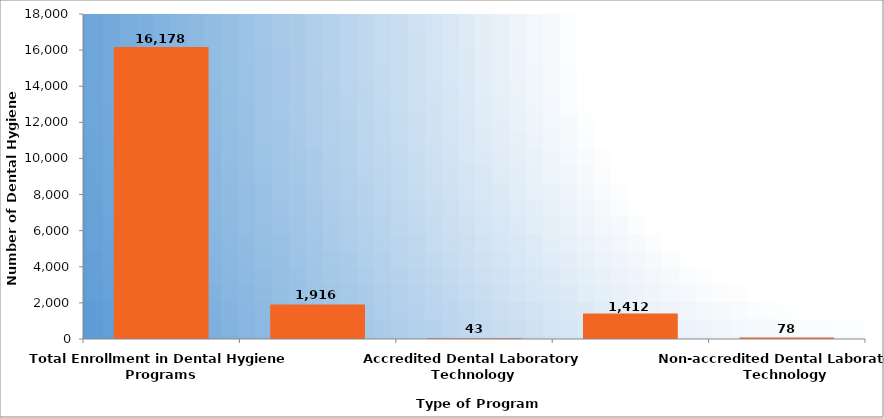
| Category | Number of Dental Hygiene Students |
|---|---|
| Total Enrollment in Dental Hygiene Programs | 16178 |
| Accredited Dental Assisting | 1916 |
| Accredited Dental Laboratory Technology | 43 |
| Non-accredited Dental Assisting | 1412 |
| Non-accredited Dental Laboratory Technology | 78 |